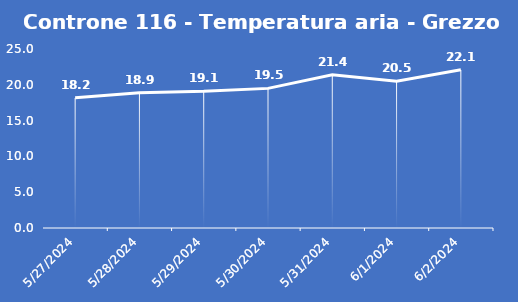
| Category | Controne 116 - Temperatura aria - Grezzo (°C) |
|---|---|
| 5/27/24 | 18.2 |
| 5/28/24 | 18.9 |
| 5/29/24 | 19.1 |
| 5/30/24 | 19.5 |
| 5/31/24 | 21.4 |
| 6/1/24 | 20.5 |
| 6/2/24 | 22.1 |